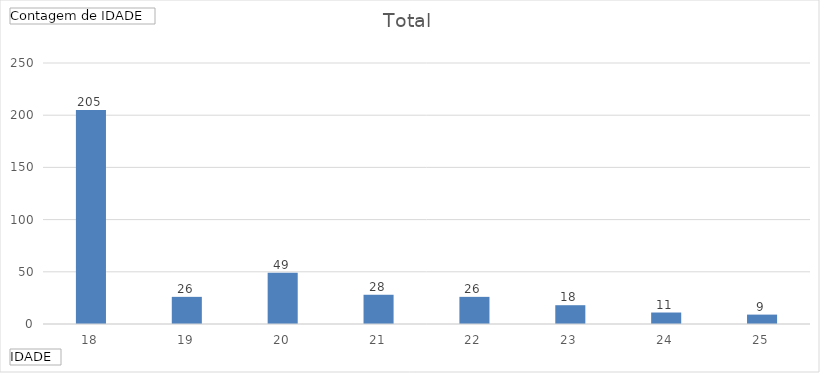
| Category | Total |
|---|---|
| 18 | 205 |
| 19 | 26 |
| 20 | 49 |
| 21 | 28 |
| 22 | 26 |
| 23 | 18 |
| 24 | 11 |
| 25 | 9 |